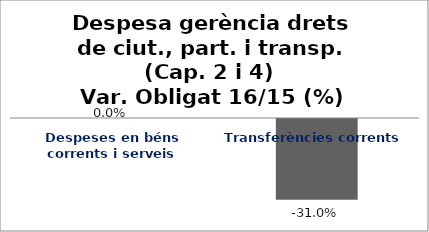
| Category | Series 0 |
|---|---|
| Despeses en béns corrents i serveis | 0 |
| Transferències corrents | -0.31 |